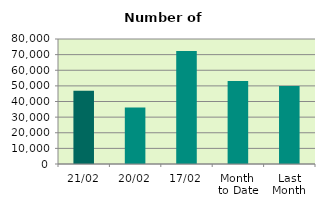
| Category | Series 0 |
|---|---|
| 21/02 | 46904 |
| 20/02 | 36226 |
| 17/02 | 72366 |
| Month 
to Date | 53195.467 |
| Last
Month | 49894.952 |